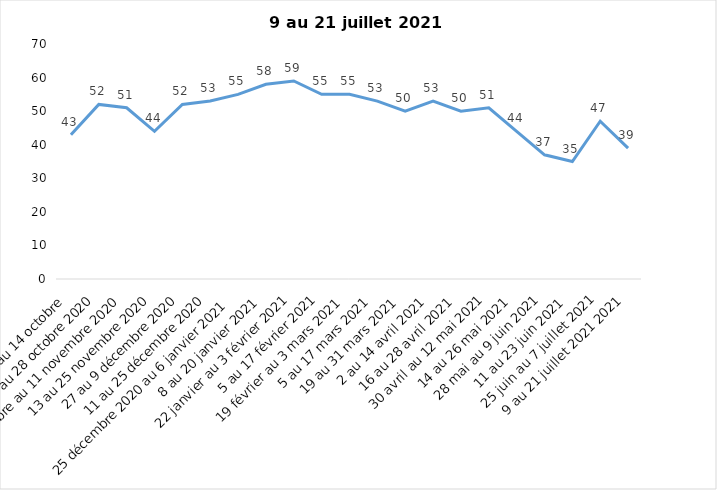
| Category | Toujours aux trois mesures |
|---|---|
| 2 au 14 octobre  | 43 |
| 16 au 28 octobre 2020 | 52 |
| 30 octobre au 11 novembre 2020 | 51 |
| 13 au 25 novembre 2020 | 44 |
| 27 au 9 décembre 2020 | 52 |
| 11 au 25 décembre 2020 | 53 |
| 25 décembre 2020 au 6 janvier 2021 | 55 |
| 8 au 20 janvier 2021 | 58 |
| 22 janvier au 3 février 2021 | 59 |
| 5 au 17 février 2021 | 55 |
| 19 février au 3 mars 2021 | 55 |
| 5 au 17 mars 2021 | 53 |
| 19 au 31 mars 2021 | 50 |
| 2 au 14 avril 2021 | 53 |
| 16 au 28 avril 2021 | 50 |
| 30 avril au 12 mai 2021 | 51 |
| 14 au 26 mai 2021 | 44 |
| 28 mai au 9 juin 2021 | 37 |
| 11 au 23 juin 2021 | 35 |
| 25 juin au 7 juillet 2021 | 47 |
| 9 au 21 juillet 2021 2021 | 39 |